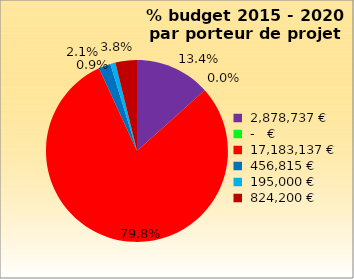
| Category | % |
|---|---|
| 2878737.0 | 0.134 |
| 0.0 | 0 |
| 17183136.880772762 | 0.798 |
| 456814.5820238844 | 0.021 |
| 195000.0 | 0.009 |
| 824200.0 | 0.038 |